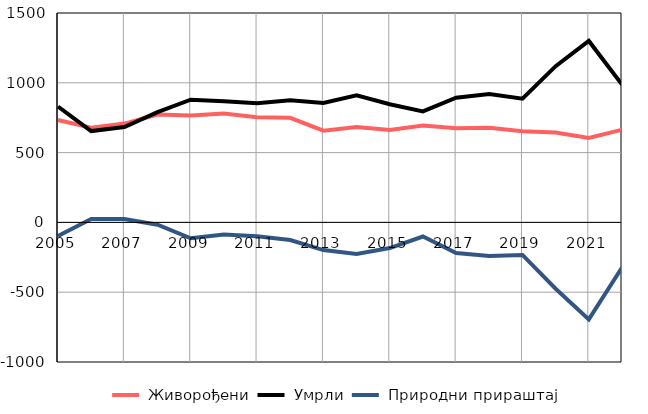
| Category |  Живорођени |  Умрли |  Природни прираштај |
|---|---|---|---|
| 2005.0 | 733 | 830 | -97 |
| 2006.0 | 678 | 654 | 24 |
| 2007.0 | 708 | 683 | 25 |
| 2008.0 | 773 | 790 | -17 |
| 2009.0 | 765 | 879 | -114 |
| 2010.0 | 780 | 867 | -87 |
| 2011.0 | 754 | 854 | -100 |
| 2012.0 | 749 | 875 | -126 |
| 2013.0 | 657 | 855 | -198 |
| 2014.0 | 684 | 911 | -227 |
| 2015.0 | 662 | 846 | -184 |
| 2016.0 | 694 | 795 | -101 |
| 2017.0 | 674 | 893 | -219 |
| 2018.0 | 678 | 919 | -241 |
| 2019.0 | 653 | 886 | -233 |
| 2020.0 | 644 | 1119 | -475 |
| 2021.0 | 605 | 1300 | -695 |
| 2022.0 | 664 | 987 | -323 |